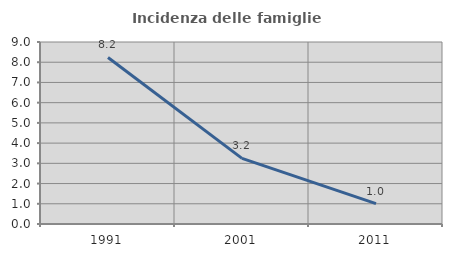
| Category | Incidenza delle famiglie numerose |
|---|---|
| 1991.0 | 8.235 |
| 2001.0 | 3.247 |
| 2011.0 | 1.01 |